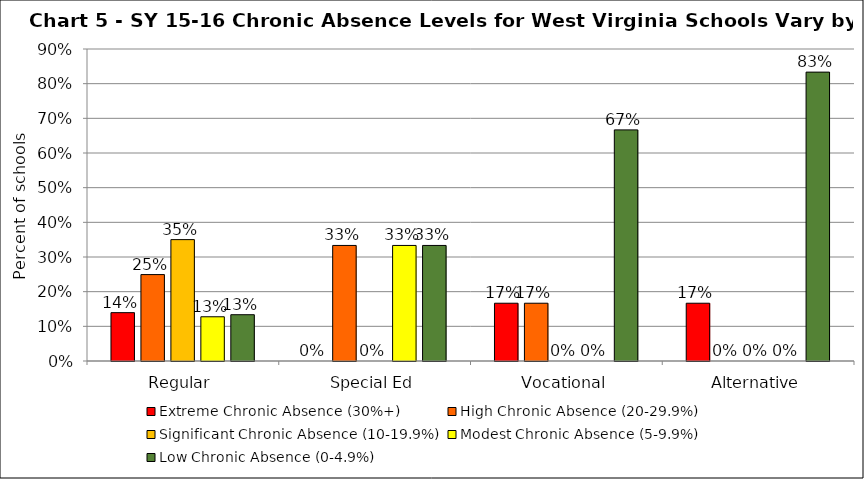
| Category | Extreme Chronic Absence (30%+) | High Chronic Absence (20-29.9%) | Significant Chronic Absence (10-19.9%) | Modest Chronic Absence (5-9.9%) | Low Chronic Absence (0-4.9%) |
|---|---|---|---|---|---|
| 0 | 0.139 | 0.249 | 0.35 | 0.128 | 0.134 |
| 1 | 0 | 0.333 | 0 | 0.333 | 0.333 |
| 2 | 0.167 | 0.167 | 0 | 0 | 0.667 |
| 3 | 0.167 | 0 | 0 | 0 | 0.833 |